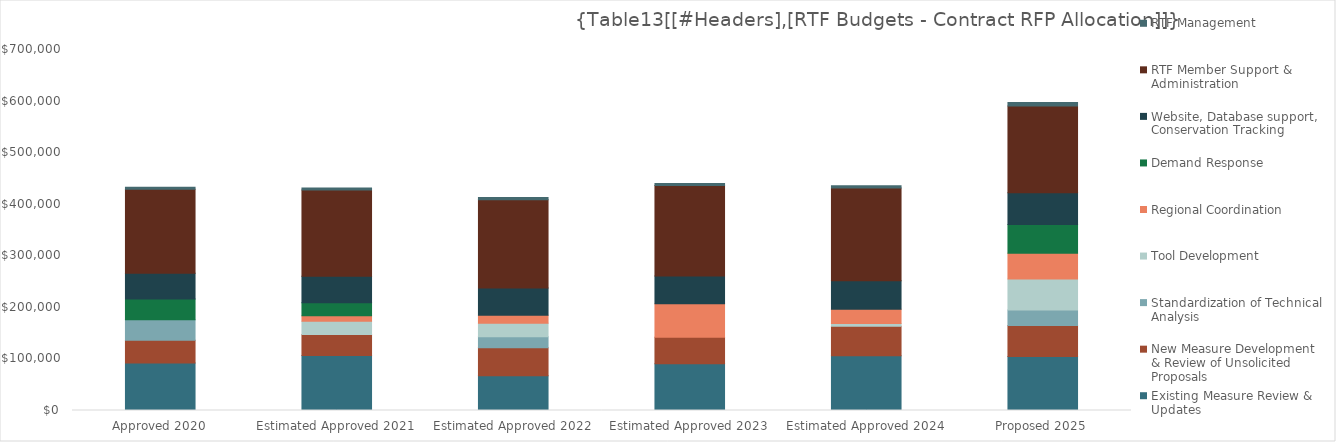
| Category | Existing Measure Review & Updates | New Measure Development & Review of Unsolicited Proposals | Standardization of Technical Analysis | Tool Development | Regional Coordination | Demand Response | Website, Database support, Conservation Tracking  | RTF Member Support & Administration | RTF Management |
|---|---|---|---|---|---|---|---|---|---|
| Approved 2020 | 92000 | 44000 | 40000 | 0 | 0 | 40000 | 50000 | 163000 | 4000 |
| Estimated Approved 2021 | 106600 | 41000 | 0 | 25600 | 10300 | 25600 | 51300 | 167100 | 4100 |
| Estimated Approved 2022 | 67200 | 54600 | 21000 | 26300 | 15800 | 0 | 52500 | 171300 | 4200 |
| Estimated Approved 2023 | 90500 | 51700 | 0 | 0 | 64600 | 0 | 53800 | 175500 | 4300 |
| Estimated Approved 2024 | 106000 | 57400 | 0 | 5500 | 27600 | 0 | 55200 | 179900 | 4400 |
| Proposed 2025 | 104500 | 60500 | 30000 | 60000 | 50000 | 55500 | 61700 | 168200 | 7000 |